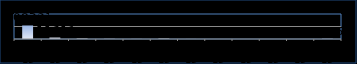
| Category | Series 0 |
|---|---|
| Jan 15 | 108231 |
| Feb 15 | 11613 |
| Mar 15 | 3853 |
| Apr 15 | 1593 |
| May 15 | 698 |
| Jun 15 | 3551 |
| Jul 15 | 344 |
| Aug 15 | 96 |
| Sep 15 | 85 |
| Oct 15 | 17 |
| Nov 15 | 9 |
| Dec 15 | 2246 |